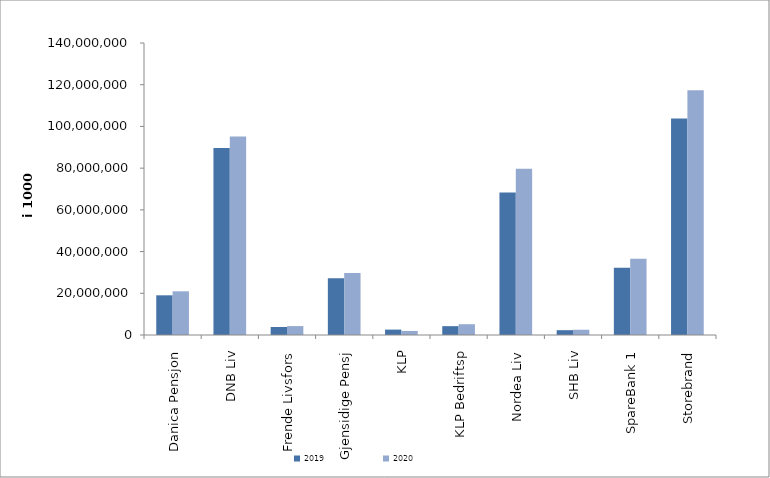
| Category | 2019 | 2020 |
|---|---|---|
| Danica Pensjon | 19030607.529 | 20948913.26 |
| DNB Liv | 89715002.027 | 95193910.071 |
| Frende Livsfors | 3826787 | 4269268 |
| Gjensidige Pensj | 27221258.8 | 29754862.8 |
| KLP | 2587219.183 | 1933154.621 |
| KLP Bedriftsp | 4242225 | 5167910 |
| Nordea Liv | 68352090 | 79687040 |
| SHB Liv | 2307693.04 | 2514066.68 |
| SpareBank 1 | 32200221.13 | 36536483.393 |
| Storebrand | 103774197.524 | 117297307.317 |